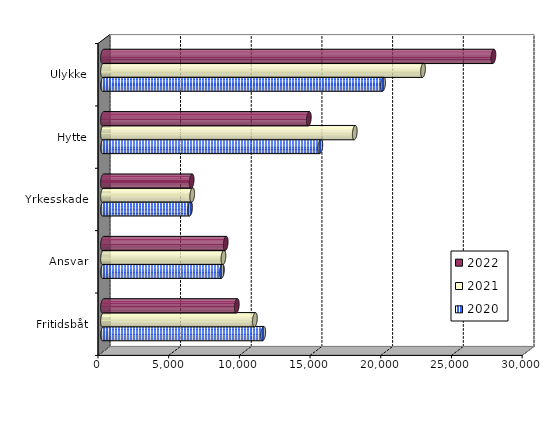
| Category | 2020 | 2021 | 2022 |
|---|---|---|---|
| Fritidsbåt | 11333.993 | 10743.278 | 9463.556 |
| Ansvar | 8411.96 | 8518.846 | 8678.91 |
| Yrkesskade | 6161.354 | 6310.199 | 6270.612 |
| Hytte | 15370.772 | 17809.5 | 14558.442 |
| Ulykke | 19809.118 | 22635.92 | 27615.32 |